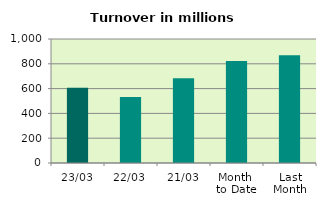
| Category | Series 0 |
|---|---|
| 23/03 | 607.464 |
| 22/03 | 531.361 |
| 21/03 | 682.794 |
| Month 
to Date | 823.357 |
| Last
Month | 868.35 |